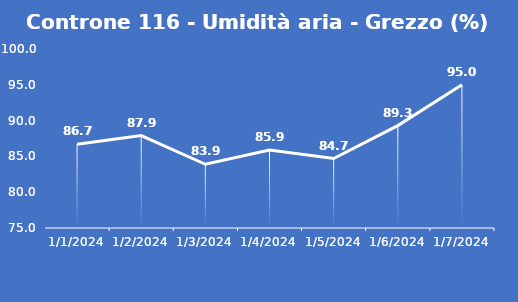
| Category | Controne 116 - Umidità aria - Grezzo (%) |
|---|---|
| 1/1/24 | 86.7 |
| 1/2/24 | 87.9 |
| 1/3/24 | 83.9 |
| 1/4/24 | 85.9 |
| 1/5/24 | 84.7 |
| 1/6/24 | 89.3 |
| 1/7/24 | 95 |